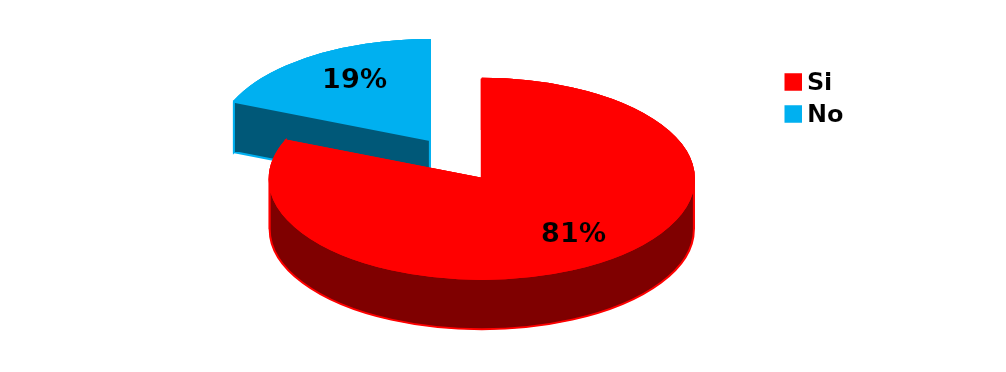
| Category | Series 0 |
|---|---|
| Si | 91 |
| No | 21 |